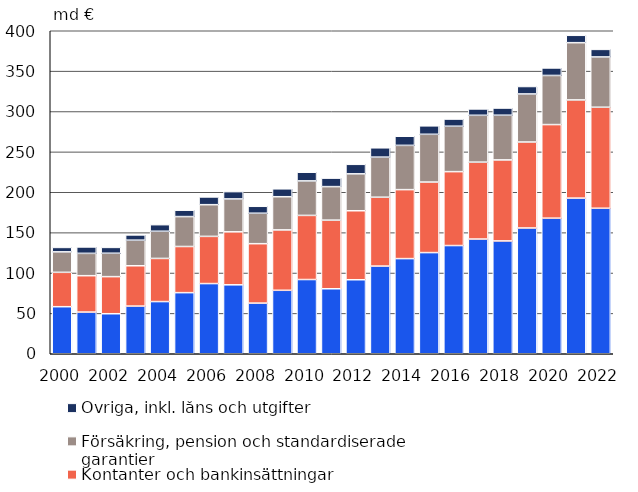
| Category | Aktier och andelar i placeringsfonder | Kontanter och bankinsättningar | Försäkring, pension och standardiserade garantier | Övriga, inkl. låns och utgifter |
|---|---|---|---|---|
| 2000.0 | 58.266 | 42.573 | 25.36 | 5.46 |
| 2001.0 | 51.618 | 45.069 | 27.649 | 7.907 |
| 2002.0 | 49.571 | 45.922 | 28.968 | 7.236 |
| 2003.0 | 59.026 | 49.971 | 31.663 | 6.481 |
| 2004.0 | 64.621 | 53.42 | 33.677 | 8.149 |
| 2005.0 | 75.676 | 57.148 | 37.042 | 7.902 |
| 2006.0 | 86.915 | 58.446 | 39.238 | 9.588 |
| 2007.0 | 85.372 | 65.625 | 40.738 | 9.072 |
| 2008.0 | 62.729 | 73.578 | 37.721 | 8.577 |
| 2009.0 | 78.583 | 74.795 | 41.097 | 9.798 |
| 2010.0 | 91.924 | 79.41 | 42.729 | 10.718 |
| 2011.0 | 80.487 | 84.979 | 41.506 | 10.538 |
| 2012.0 | 91.659 | 85.441 | 45.7 | 11.788 |
| 2013.0 | 108.584 | 85.28 | 49.639 | 11.548 |
| 2014.0 | 117.823 | 85.421 | 54.812 | 11.291 |
| 2015.0 | 125.278 | 87.372 | 59.129 | 10.484 |
| 2016.0 | 134.016 | 91.524 | 56.217 | 8.878 |
| 2017.0 | 142.073 | 95.232 | 57.996 | 7.854 |
| 2018.0 | 139.737 | 100.335 | 55.324 | 8.888 |
| 2019.0 | 155.747 | 106.494 | 59.495 | 9.21 |
| 2020.0 | 167.909 | 115.901 | 60.816 | 9.291 |
| 2021.0 | 192.756 | 121.598 | 70.875 | 9.14 |
| 2022.0 | 180.205 | 125.096 | 62.279 | 9.344 |